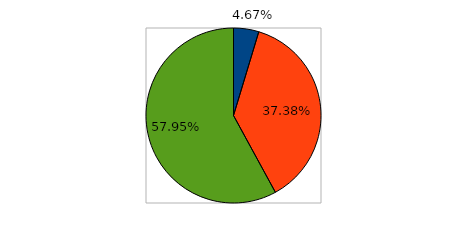
| Category | Series 0 |
|---|---|
| 0 | 0.047 |
| 1 | 0.374 |
| 2 | 0.58 |